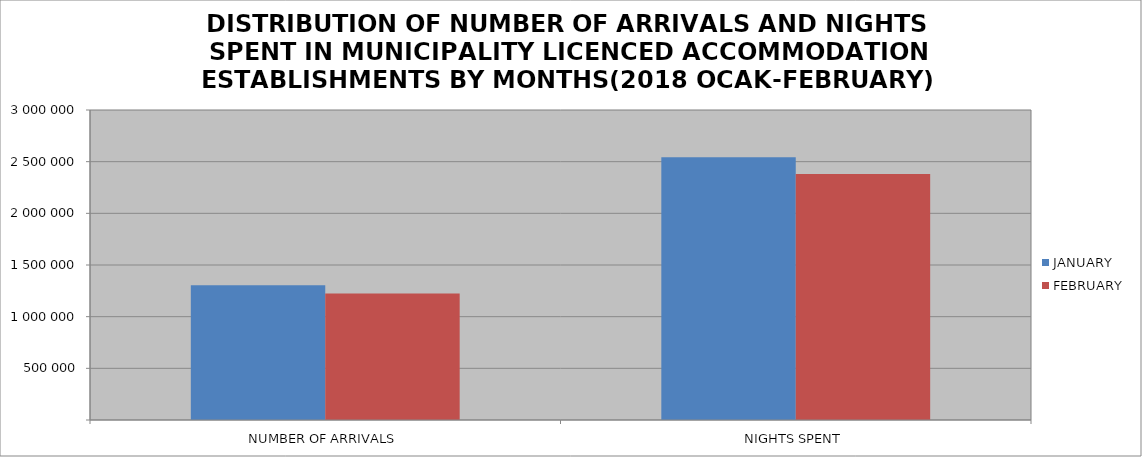
| Category | JANUARY | FEBRUARY |
|---|---|---|
| NUMBER OF ARRIVALS | 1303353 | 1223475 |
| NIGHTS SPENT | 2542103 | 2381300 |